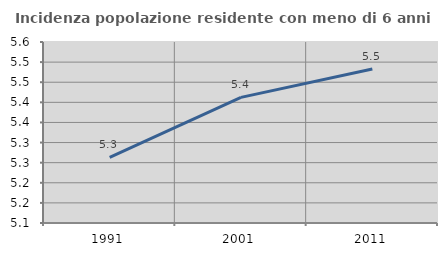
| Category | Incidenza popolazione residente con meno di 6 anni |
|---|---|
| 1991.0 | 5.263 |
| 2001.0 | 5.412 |
| 2011.0 | 5.483 |